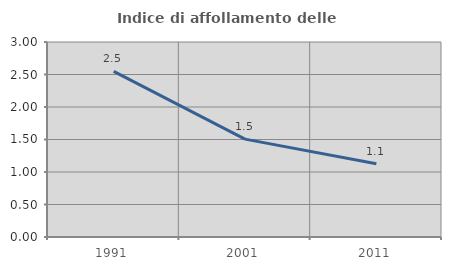
| Category | Indice di affollamento delle abitazioni  |
|---|---|
| 1991.0 | 2.549 |
| 2001.0 | 1.506 |
| 2011.0 | 1.127 |